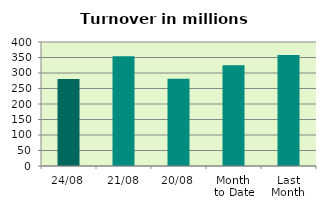
| Category | Series 0 |
|---|---|
| 24/08 | 280.765 |
| 21/08 | 354.239 |
| 20/08 | 281.702 |
| Month 
to Date | 325.137 |
| Last
Month | 357.784 |